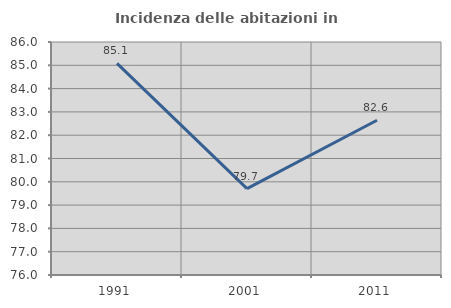
| Category | Incidenza delle abitazioni in proprietà  |
|---|---|
| 1991.0 | 85.082 |
| 2001.0 | 79.705 |
| 2011.0 | 82.641 |